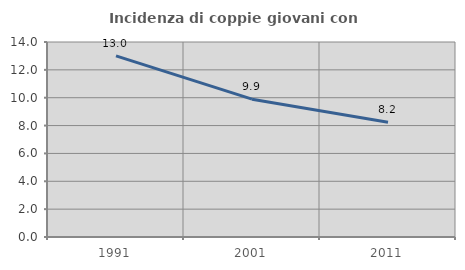
| Category | Incidenza di coppie giovani con figli |
|---|---|
| 1991.0 | 13.005 |
| 2001.0 | 9.895 |
| 2011.0 | 8.235 |